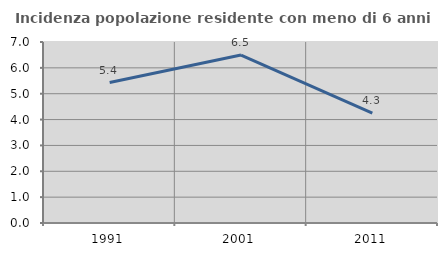
| Category | Incidenza popolazione residente con meno di 6 anni |
|---|---|
| 1991.0 | 5.432 |
| 2001.0 | 6.496 |
| 2011.0 | 4.25 |